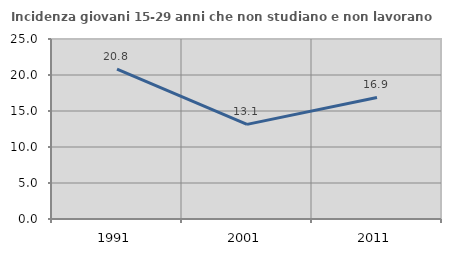
| Category | Incidenza giovani 15-29 anni che non studiano e non lavorano  |
|---|---|
| 1991.0 | 20.812 |
| 2001.0 | 13.141 |
| 2011.0 | 16.881 |